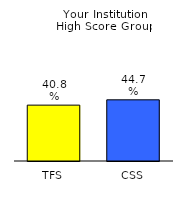
| Category | Series 0 |
|---|---|
| TFS | 0.408 |
| CSS | 0.447 |